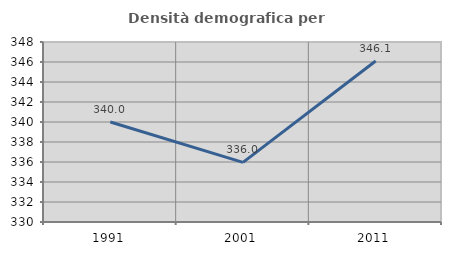
| Category | Densità demografica |
|---|---|
| 1991.0 | 340.004 |
| 2001.0 | 335.968 |
| 2011.0 | 346.1 |